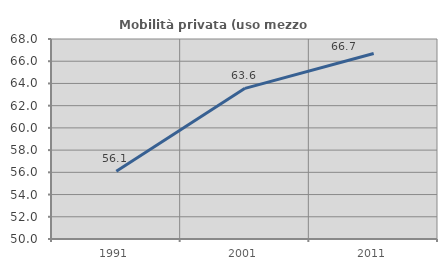
| Category | Mobilità privata (uso mezzo privato) |
|---|---|
| 1991.0 | 56.104 |
| 2001.0 | 63.558 |
| 2011.0 | 66.699 |